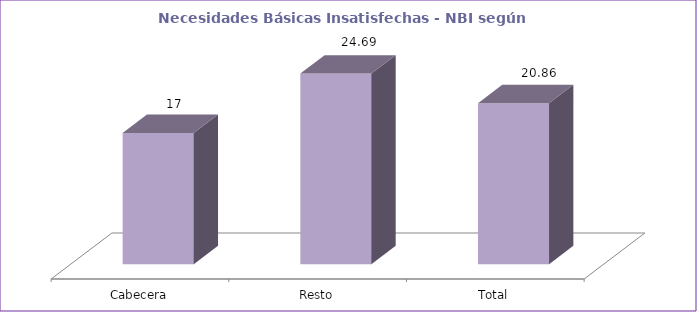
| Category | Series 0 |
|---|---|
| Cabecera | 17 |
| Resto | 24.69 |
| Total | 20.86 |